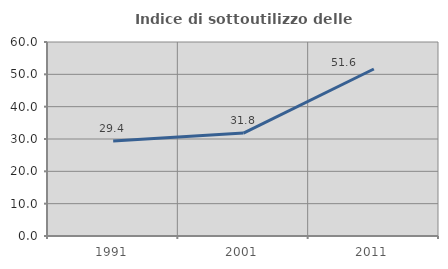
| Category | Indice di sottoutilizzo delle abitazioni  |
|---|---|
| 1991.0 | 29.412 |
| 2001.0 | 31.818 |
| 2011.0 | 51.648 |